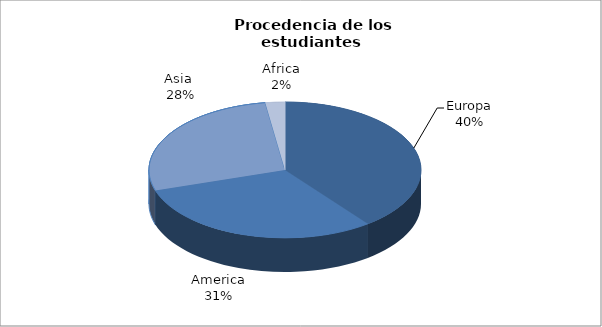
| Category | Series 0 |
|---|---|
| Europa | 973 |
| America | 750 |
| Asia  | 678 |
| Africa | 57 |